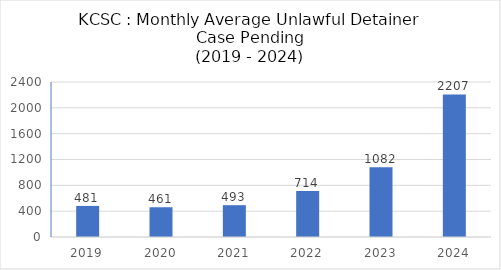
| Category | Series 0 |
|---|---|
| 2019.0 | 481.333 |
| 2020.0 | 460.667 |
| 2021.0 | 492.75 |
| 2022.0 | 714.167 |
| 2023.0 | 1081.833 |
| 2024.0 | 2206.667 |